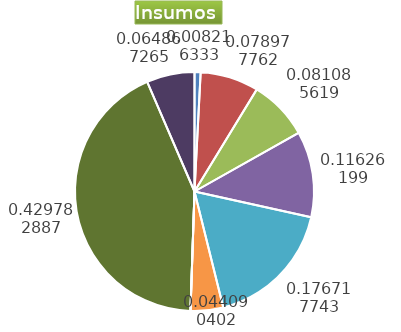
| Category | Series 0 |
|---|---|
| Control arvenses | 262992 |
| Control fitosanitario | 2527955 |
| Cosecha y beneficio | 2595424.23 |
| Fertilización | 3721365 |
| Instalación | 5656459.367 |
| Otros | 1411265 |
| Podas | 0 |
| Riego | 0 |
| Transporte | 13756680 |
| Tutorado | 2076300 |